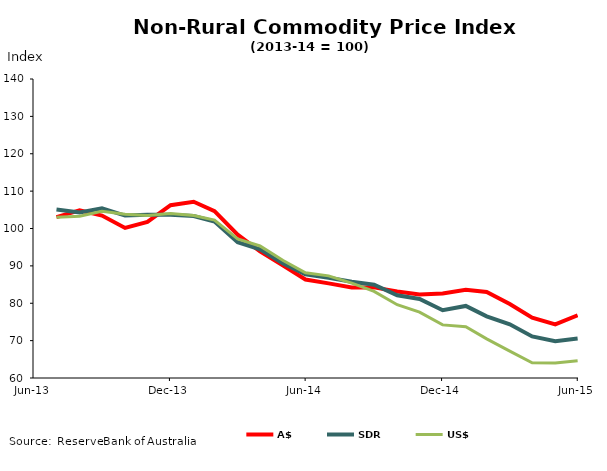
| Category | A$ | SDR | US$ |
|---|---|---|---|
| 2013-07-31 | 103.042 | 105.085 | 102.997 |
| 2013-08-31 | 104.85 | 104.289 | 103.26 |
| 2013-09-30 | 103.454 | 105.414 | 104.593 |
| 2013-10-31 | 100.141 | 103.457 | 103.815 |
| 2013-11-30 | 101.762 | 103.678 | 103.478 |
| 2013-12-31 | 106.244 | 103.699 | 104.003 |
| 2014-01-31 | 107.146 | 103.351 | 103.477 |
| 2014-02-28 | 104.651 | 101.88 | 102.253 |
| 2014-03-31 | 98.35 | 96.351 | 97.224 |
| 2014-04-30 | 93.884 | 94.445 | 95.33 |
| 2014-05-31 | 90.112 | 90.607 | 91.417 |
| 2014-06-30 | 86.363 | 87.744 | 88.153 |
| 2014-07-31 | 85.316 | 86.842 | 87.322 |
| 2014-08-31 | 84.221 | 85.772 | 85.389 |
| 2014-09-30 | 84.245 | 84.964 | 83.185 |
| 2014-10-31 | 83.169 | 82.14 | 79.618 |
| 2014-11-30 | 82.346 | 81.135 | 77.626 |
| 2014-12-31 | 82.615 | 78.122 | 74.213 |
| 2015-01-31 | 83.604 | 79.286 | 73.721 |
| 2015-02-28 | 83.002 | 76.5 | 70.462 |
| 2015-03-31 | 79.775 | 74.356 | 67.207 |
| 2015-04-30 | 76.116 | 71.117 | 64.081 |
| 2015-05-31 | 74.325 | 69.848 | 64.002 |
| 2015-06-30 | 76.79 | 70.575 | 64.622 |